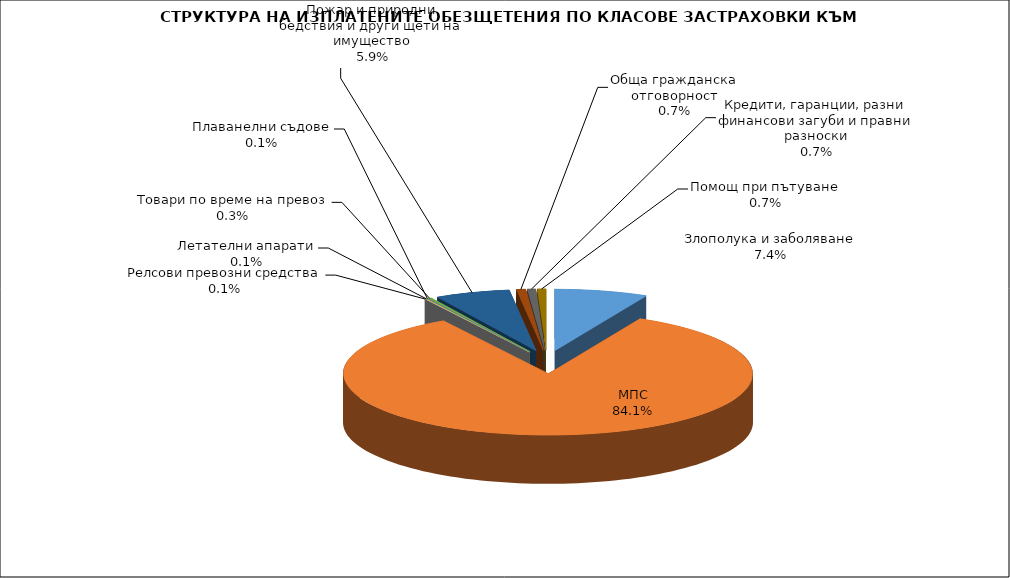
| Category | Злополука и заболяване |
|---|---|
| Злополука и заболяване | 0.074 |
| МПС | 0.841 |
| Релсови превозни средства | 0.001 |
| Летателни апарати | 0.001 |
| Плаванелни съдове | 0.001 |
| Товари по време на превоз | 0.003 |
| Пожар и природни бедствия и други щети на имущество | 0.059 |
| Обща гражданска отговорност | 0.007 |
| Кредити, гаранции, разни финансови загуби и правни разноски | 0.007 |
| Помощ при пътуване | 0.007 |